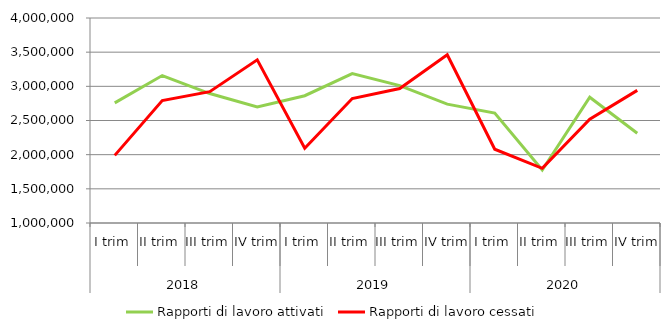
| Category | Rapporti di lavoro attivati | Rapporti di lavoro cessati |
|---|---|---|
| 0 | 2758008 | 1989518 |
| 1 | 3157553 | 2792436 |
| 2 | 2894500 | 2921736 |
| 3 | 2699158 | 3387166 |
| 4 | 2862791 | 2093786 |
| 5 | 3186113 | 2821770 |
| 6 | 3010585 | 2966932 |
| 7 | 2739451 | 3462014 |
| 8 | 2608888 | 2079223 |
| 9 | 1775804 | 1799974 |
| 10 | 2839859 | 2519425 |
| 11 | 2313582 | 2940424 |